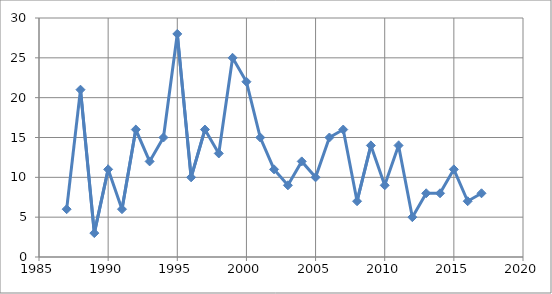
| Category | Series 0 |
|---|---|
| 1987.0 | 6 |
| 1988.0 | 21 |
| 1989.0 | 3 |
| 1990.0 | 11 |
| 1991.0 | 6 |
| 1992.0 | 16 |
| 1993.0 | 12 |
| 1994.0 | 15 |
| 1995.0 | 28 |
| 1996.0 | 10 |
| 1997.0 | 16 |
| 1998.0 | 13 |
| 1999.0 | 25 |
| 2000.0 | 22 |
| 2001.0 | 15 |
| 2002.0 | 11 |
| 2003.0 | 9 |
| 2004.0 | 12 |
| 2005.0 | 10 |
| 2006.0 | 15 |
| 2007.0 | 16 |
| 2008.0 | 7 |
| 2009.0 | 14 |
| 2010.0 | 9 |
| 2011.0 | 14 |
| 2012.0 | 5 |
| 2013.0 | 8 |
| 2014.0 | 8 |
| 2015.0 | 11 |
| 2016.0 | 7 |
| 2017.0 | 8 |